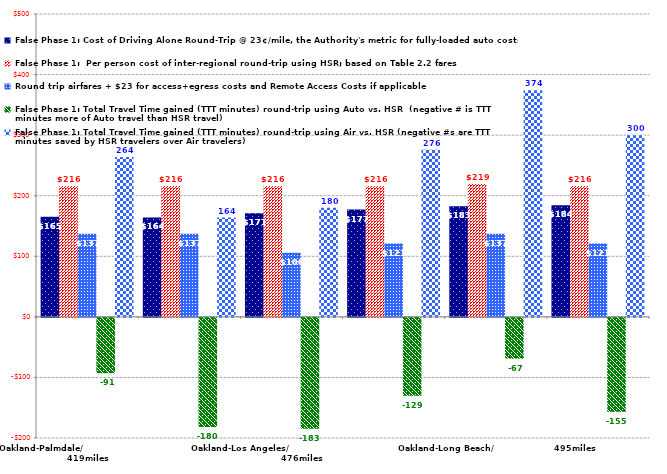
| Category | False Phase 1: Cost of Driving Alone Round-Trip @ 23¢/mile, the Authority's metric for fully-loaded auto costs | False Phase 1:  Per person cost of inter-regional round-trip using HSR; based on Table 2.2 fares | Round trip airfares + $23 for access+egress costs and Remote Access Costs if applicable | False Phase 1: Total Travel Time gained (TTT minutes) round-trip using Auto vs. HSR  (negative # is TTT minutes more of Auto travel than HSR travel) | False Phase 1: Total Travel Time gained (TTT minutes) round-trip using Air vs. HSR (negative #s are TTT minutes saved by HSR travelers over Air travelers) |
|---|---|---|---|---|---|
| Oakland-Palmdale/                                  419miles | 165.14 | 215.9 | 137 | -91.5 | 264 |
| Oakland-Burbank (BUR)/                        470miles | 164.22 | 215.9 | 137 | -180 | 164 |
| Oakland-Los Angeles/                                            476miles | 171.12 | 215.9 | 106 | -183.1 | 180 |
| Oakland-OC Gateway/                    490miles | 177.1 | 215.9 | 121 | -128.5 | 276 |
| Oakland-Long Beach/                    495miles | 182.62 | 219.4 | 137 | -67.3 | 374 |
| Oakland-Anaheim/                                  503miles | 184.46 | 215.9 | 121 | -155.1 | 300 |